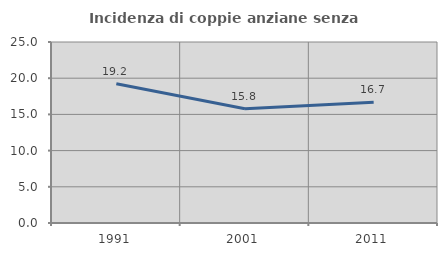
| Category | Incidenza di coppie anziane senza figli  |
|---|---|
| 1991.0 | 19.231 |
| 2001.0 | 15.789 |
| 2011.0 | 16.667 |